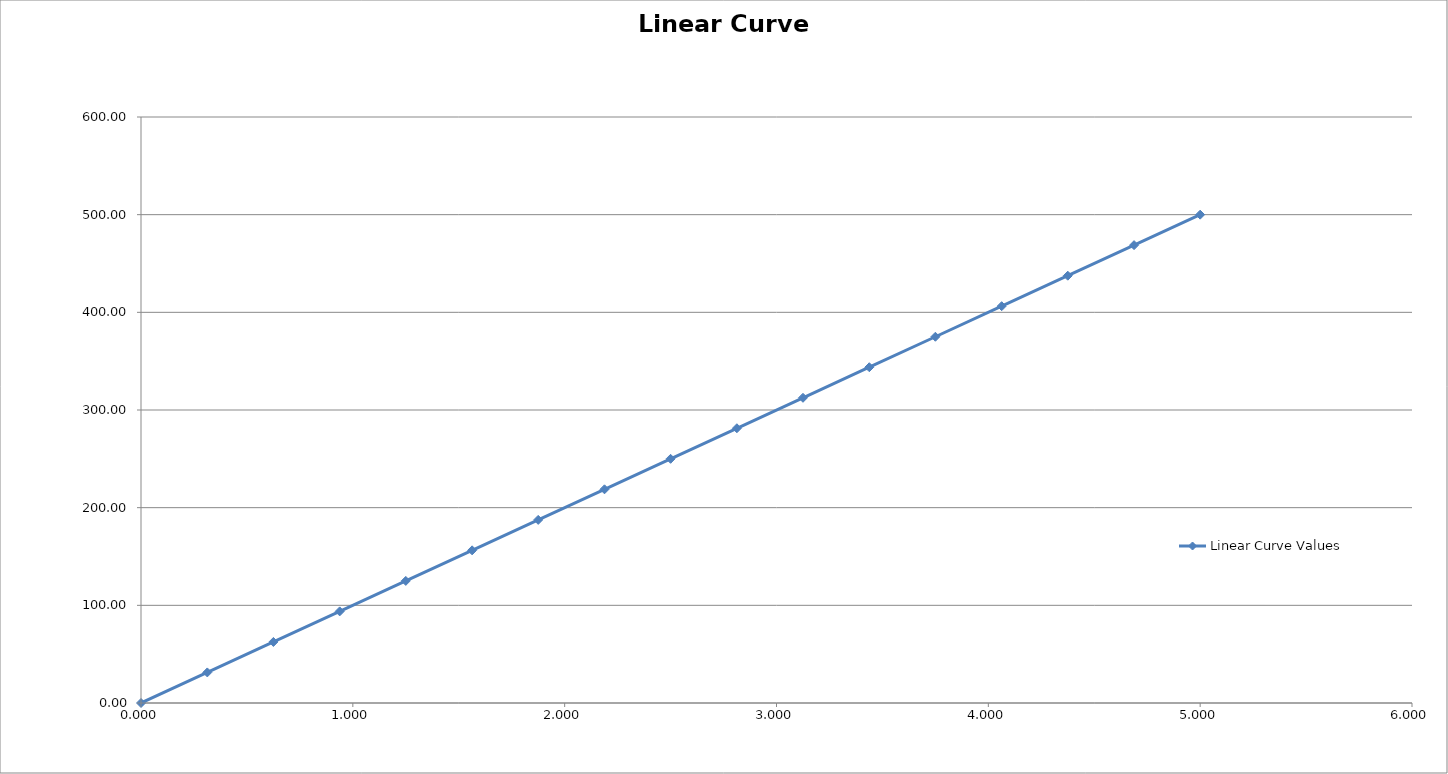
| Category | Linear Curve Values |
|---|---|
| 0.0 | 0 |
| 0.313 | 31.3 |
| 0.625 | 62.5 |
| 0.938 | 93.8 |
| 1.25 | 125 |
| 1.563 | 156.3 |
| 1.875 | 187.5 |
| 2.188 | 218.8 |
| 2.5 | 250 |
| 2.813 | 281.3 |
| 3.125 | 312.5 |
| 3.438 | 343.8 |
| 3.75 | 375 |
| 4.063 | 406.3 |
| 4.375 | 437.5 |
| 4.688 | 468.8 |
| 5.0 | 500 |